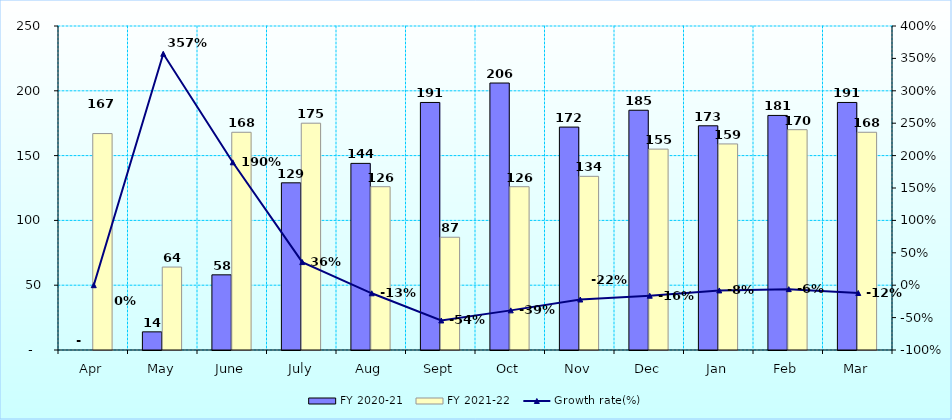
| Category | FY 2020-21 | FY 2021-22 |
|---|---|---|
| Apr | 0 | 167 |
| May | 14 | 64 |
| June | 58 | 168 |
| July | 129 | 175 |
| Aug | 144 | 126 |
| Sept | 191 | 87 |
| Oct | 206 | 126 |
| Nov | 172 | 134 |
| Dec | 185 | 155 |
| Jan | 173 | 159 |
| Feb | 181 | 170 |
| Mar | 191 | 168 |